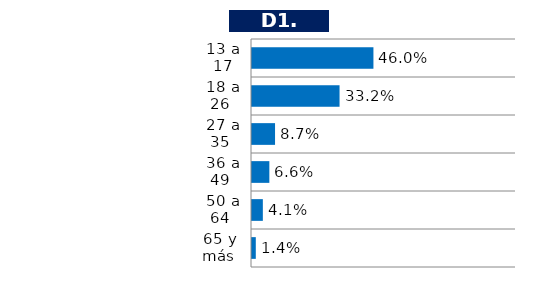
| Category | Series 0 |
|---|---|
| 13 a 17 | 0.46 |
| 18 a 26  | 0.332 |
| 27 a 35  | 0.087 |
| 36 a 49  | 0.066 |
| 50 a 64  | 0.041 |
| 65 y más  | 0.014 |